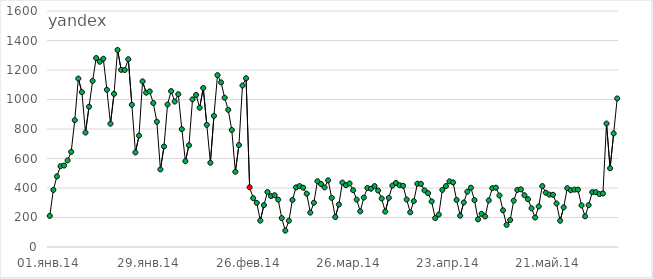
| Category | Итог |
|---|---|
| 01.янв.14 | 211 |
| 02.янв.14 | 387 |
| 03.янв.14 | 479 |
| 04.янв.14 | 548 |
| 05.янв.14 | 552 |
| 06.янв.14 | 587 |
| 07.янв.14 | 645 |
| 08.янв.14 | 860 |
| 09.янв.14 | 1142 |
| 10.янв.14 | 1050 |
| 11.янв.14 | 776 |
| 12.янв.14 | 951 |
| 13.янв.14 | 1126 |
| 14.янв.14 | 1281 |
| 15.янв.14 | 1256 |
| 16.янв.14 | 1276 |
| 17.янв.14 | 1066 |
| 18.янв.14 | 836 |
| 19.янв.14 | 1038 |
| 20.янв.14 | 1336 |
| 21.янв.14 | 1201 |
| 22.янв.14 | 1200 |
| 23.янв.14 | 1273 |
| 24.янв.14 | 964 |
| 25.янв.14 | 641 |
| 26.янв.14 | 755 |
| 27.янв.14 | 1123 |
| 28.янв.14 | 1046 |
| 29.янв.14 | 1055 |
| 30.янв.14 | 976 |
| 31.янв.14 | 849 |
| 01.фев.14 | 526 |
| 02.фев.14 | 681 |
| 03.фев.14 | 966 |
| 04.фев.14 | 1057 |
| 05.фев.14 | 986 |
| 06.фев.14 | 1036 |
| 07.фев.14 | 799 |
| 08.фев.14 | 582 |
| 09.фев.14 | 690 |
| 10.фев.14 | 1001 |
| 11.фев.14 | 1031 |
| 12.фев.14 | 944 |
| 13.фев.14 | 1078 |
| 14.фев.14 | 828 |
| 15.фев.14 | 571 |
| 16.фев.14 | 889 |
| 17.фев.14 | 1165 |
| 18.фев.14 | 1116 |
| 19.фев.14 | 1012 |
| 20.фев.14 | 930 |
| 21.фев.14 | 793 |
| 22.фев.14 | 510 |
| 23.фев.14 | 691 |
| 24.фев.14 | 1095 |
| 25.фев.14 | 1144 |
| 26.фев.14 | 405 |
| 27.фев.14 | 331 |
| 28.фев.14 | 299 |
| 01.мар.14 | 179 |
| 02.мар.14 | 284 |
| 03.мар.14 | 373 |
| 04.мар.14 | 345 |
| 05.мар.14 | 351 |
| 06.мар.14 | 321 |
| 07.мар.14 | 196 |
| 08.мар.14 | 111 |
| 09.мар.14 | 178 |
| 10.мар.14 | 319 |
| 11.мар.14 | 404 |
| 12.мар.14 | 413 |
| 13.мар.14 | 402 |
| 14.мар.14 | 361 |
| 15.мар.14 | 233 |
| 16.мар.14 | 300 |
| 17.мар.14 | 446 |
| 18.мар.14 | 427 |
| 19.мар.14 | 404 |
| 20.мар.14 | 452 |
| 21.мар.14 | 333 |
| 22.мар.14 | 203 |
| 23.мар.14 | 288 |
| 24.мар.14 | 437 |
| 25.мар.14 | 419 |
| 26.мар.14 | 431 |
| 27.мар.14 | 385 |
| 28.мар.14 | 321 |
| 29.мар.14 | 242 |
| 30.мар.14 | 335 |
| 31.мар.14 | 400 |
| 01.апр.14 | 395 |
| 02.апр.14 | 413 |
| 03.апр.14 | 383 |
| 04.апр.14 | 329 |
| 05.апр.14 | 240 |
| 06.апр.14 | 333 |
| 07.апр.14 | 416 |
| 08.апр.14 | 434 |
| 09.апр.14 | 419 |
| 10.апр.14 | 415 |
| 11.апр.14 | 322 |
| 12.апр.14 | 235 |
| 13.апр.14 | 311 |
| 14.апр.14 | 429 |
| 15.апр.14 | 428 |
| 16.апр.14 | 384 |
| 17.апр.14 | 365 |
| 18.апр.14 | 309 |
| 19.апр.14 | 196 |
| 20.апр.14 | 220 |
| 21.апр.14 | 387 |
| 22.апр.14 | 413 |
| 23.апр.14 | 445 |
| 24.апр.14 | 438 |
| 25.апр.14 | 319 |
| 26.апр.14 | 212 |
| 27.апр.14 | 302 |
| 28.апр.14 | 375 |
| 29.апр.14 | 402 |
| 30.апр.14 | 318 |
| 01.май.14 | 188 |
| 02.май.14 | 225 |
| 03.май.14 | 207 |
| 04.май.14 | 316 |
| 05.май.14 | 399 |
| 06.май.14 | 402 |
| 07.май.14 | 349 |
| 08.май.14 | 249 |
| 09.май.14 | 150 |
| 10.май.14 | 183 |
| 11.май.14 | 314 |
| 12.май.14 | 387 |
| 13.май.14 | 391 |
| 14.май.14 | 351 |
| 15.май.14 | 324 |
| 16.май.14 | 262 |
| 17.май.14 | 200 |
| 18.май.14 | 275 |
| 19.май.14 | 413 |
| 20.май.14 | 368 |
| 21.май.14 | 355 |
| 22.май.14 | 354 |
| 23.май.14 | 295 |
| 24.май.14 | 178 |
| 25.май.14 | 269 |
| 26.май.14 | 399 |
| 27.май.14 | 385 |
| 28.май.14 | 389 |
| 29.май.14 | 389 |
| 30.май.14 | 282 |
| 31.май.14 | 208 |
| 01.июн.14 | 284 |
| 02.июн.14 | 372 |
| 03.июн.14 | 372 |
| 04.июн.14 | 359 |
| 05.июн.14 | 363 |
| 06.июн.14 | 837 |
| 07.июн.14 | 534 |
| 08.июн.14 | 770 |
| 09.июн.14 | 1007 |